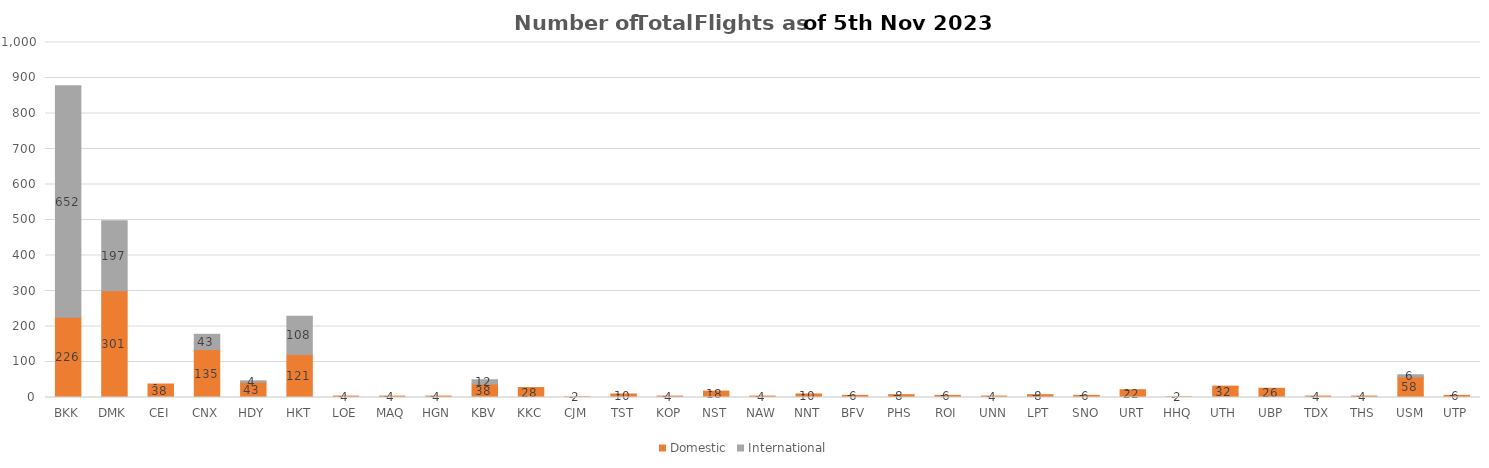
| Category | Domestic | International |
|---|---|---|
| BKK | 226 | 652 |
| DMK | 301 | 197 |
| CEI | 38 | 0 |
| CNX | 135 | 43 |
| HDY | 43 | 4 |
| HKT | 121 | 108 |
| LOE | 4 | 0 |
| MAQ | 4 | 0 |
| HGN | 4 | 0 |
| KBV | 38 | 12 |
| KKC | 28 | 0 |
| CJM | 2 | 0 |
| TST | 10 | 0 |
| KOP | 4 | 0 |
| NST | 18 | 0 |
| NAW | 4 | 0 |
| NNT | 10 | 0 |
| BFV | 6 | 0 |
| PHS | 8 | 0 |
| ROI | 6 | 0 |
| UNN | 4 | 0 |
| LPT | 8 | 0 |
| SNO | 6 | 0 |
| URT | 22 | 0 |
| HHQ | 2 | 0 |
| UTH | 32 | 0 |
| UBP | 26 | 0 |
| TDX | 4 | 0 |
| THS | 4 | 0 |
| USM | 58 | 6 |
| UTP | 6 | 0 |